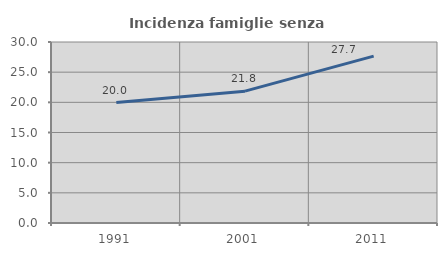
| Category | Incidenza famiglie senza nuclei |
|---|---|
| 1991.0 | 19.958 |
| 2001.0 | 21.849 |
| 2011.0 | 27.658 |